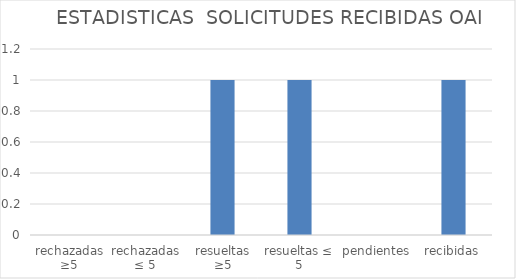
| Category | Series 0 |
|---|---|
| rechazadas ≥5 | 0 |
| rechazadas ≤ 5 | 0 |
| resueltas ≥5 | 1 |
| resueltas ≤ 5 | 1 |
| pendientes | 0 |
| recibidas | 1 |